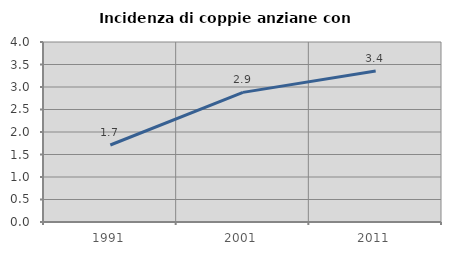
| Category | Incidenza di coppie anziane con figli |
|---|---|
| 1991.0 | 1.711 |
| 2001.0 | 2.88 |
| 2011.0 | 3.356 |